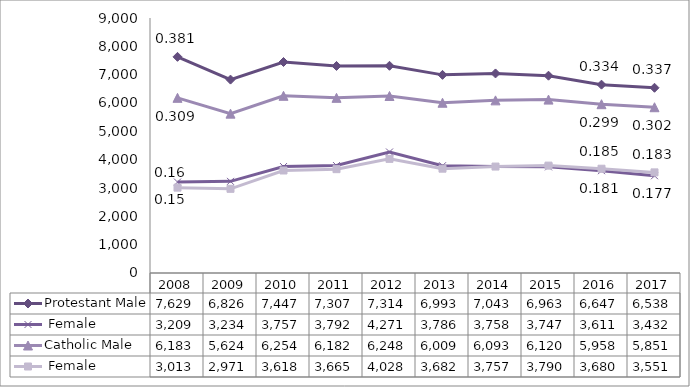
| Category | Protestant | Catholic |
|---|---|---|
| 2008.0 | 3209 | 3013 |
| 2009.0 | 3234 | 2971 |
| 2010.0 | 3757 | 3618 |
| 2011.0 | 3792 | 3665 |
| 2012.0 | 4271 | 4028 |
| 2013.0 | 3786 | 3682 |
| 2014.0 | 3758 | 3757 |
| 2015.0 | 3747 | 3790 |
| 2016.0 | 3611 | 3680 |
| 2017.0 | 3432 | 3551 |